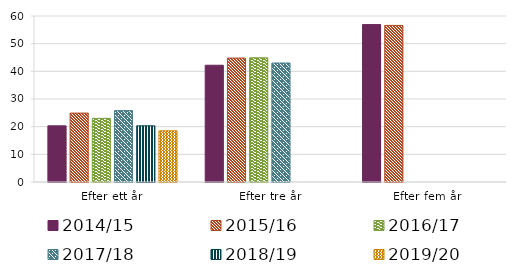
| Category | 2014/15 | 2015/16 | 2016/17 | 2017/18 | 2018/19 | 2019/20 |
|---|---|---|---|---|---|---|
| Efter ett år | 20.3 | 24.9 | 23 | 25.8 | 20.3 | 18.5 |
| Efter tre år | 42.2 | 44.8 | 44.9 | 43 | 0 | 0 |
| Efter fem år | 56.9 | 56.6 | 0 | 0 | 0 | 0 |